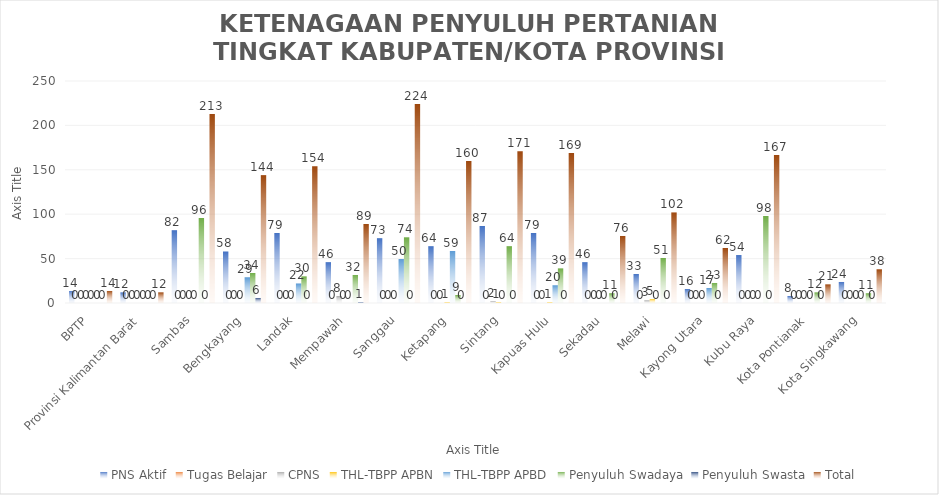
| Category | PNS Aktif | Tugas Belajar | CPNS | THL-TBPP APBN | THL-TBPP APBD | Penyuluh Swadaya | Penyuluh Swasta | Total |
|---|---|---|---|---|---|---|---|---|
| BPTP | 14 | 0 | 0 | 0 | 0 | 0 | 0 | 14 |
| Provinsi Kalimantan Barat | 12 | 0 | 0 | 0 | 0 | 0 | 0 | 12 |
| Sambas | 82 | 0 | 0 | 0 | 0 | 96 | 0 | 213 |
| Bengkayang | 58 | 0 | 0 | 0 | 29 | 34 | 6 | 144 |
| Landak | 79 | 0 | 0 | 0 | 22 | 30 | 0 | 154 |
| Mempawah | 46 | 0 | 8 | 0 | 0 | 32 | 1 | 89 |
| Sanggau | 73 | 0 | 0 | 0 | 50 | 74 | 0 | 224 |
| Ketapang | 64 | 0 | 0 | 1 | 59 | 9 | 0 | 160 |
| Sintang | 87 | 0 | 2 | 1 | 0 | 64 | 0 | 171 |
| Kapuas Hulu | 79 | 0 | 0 | 1 | 20 | 39 | 0 | 169 |
| Sekadau | 46 | 0 | 0 | 0 | 0 | 11 | 0 | 76 |
| Melawi | 33 | 0 | 3 | 5 | 0 | 51 | 0 | 102 |
| Kayong Utara | 16 | 0 | 0 | 0 | 17 | 23 | 0 | 62 |
| Kubu Raya | 54 | 0 | 0 | 0 | 0 | 98 | 0 | 167 |
| Kota Pontianak | 8 | 0 | 0 | 0 | 0 | 12 | 0 | 21 |
| Kota Singkawang | 24 | 0 | 0 | 0 | 0 | 11 | 0 | 38 |